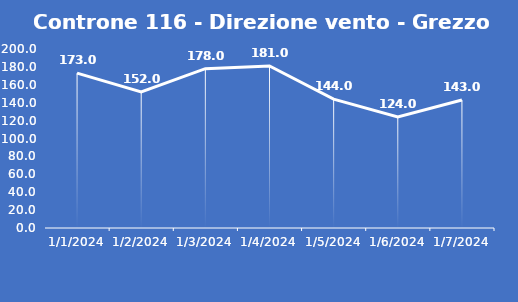
| Category | Controne 116 - Direzione vento - Grezzo (°N) |
|---|---|
| 1/1/24 | 173 |
| 1/2/24 | 152 |
| 1/3/24 | 178 |
| 1/4/24 | 181 |
| 1/5/24 | 144 |
| 1/6/24 | 124 |
| 1/7/24 | 143 |